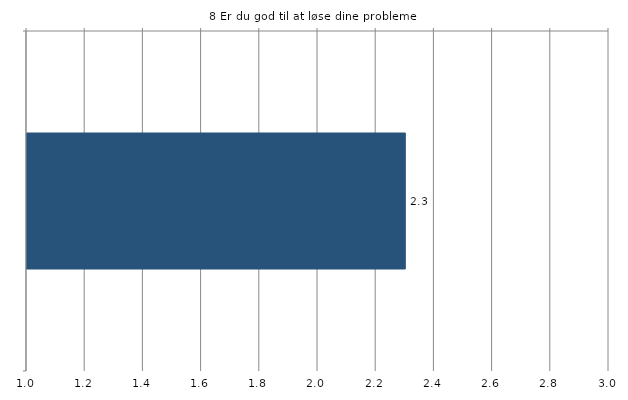
| Category | Gns. |
|---|---|
|   | 2.3 |